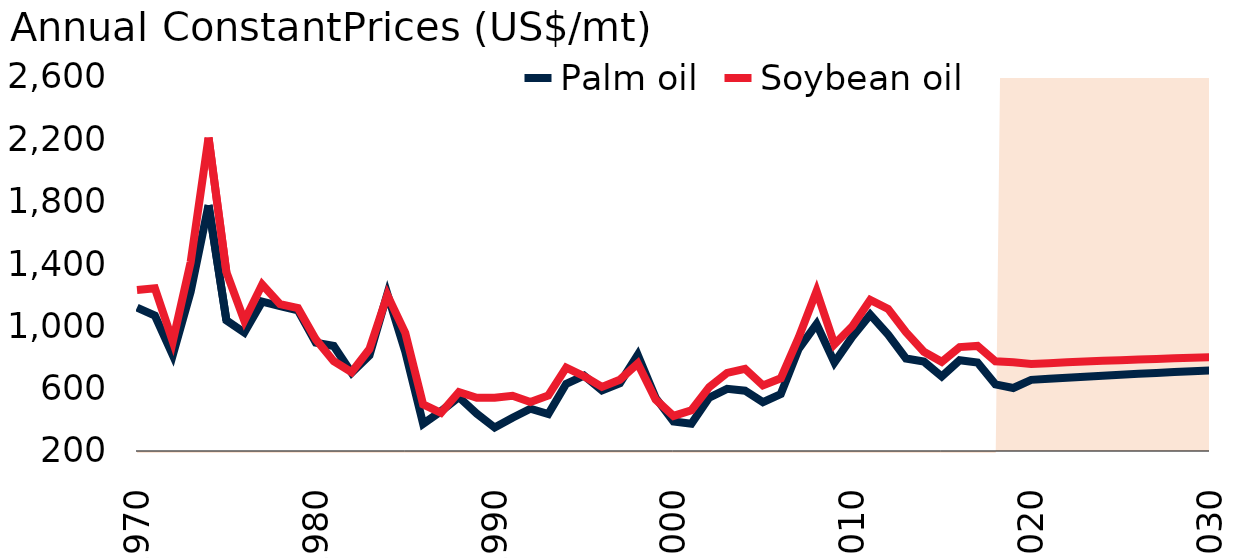
| Category | Palm oil | Soybean oil |
|---|---|---|
| 1970.0 | 1120.182 | 1233.419 |
| 1971.0 | 1068.791 | 1244.13 |
| 1972.0 | 815.759 | 903.34 |
| 1973.0 | 1222.337 | 1411.615 |
| 1974.0 | 1777.509 | 2210.861 |
| 1975.0 | 1038.612 | 1347.596 |
| 1976.0 | 960.711 | 1035.858 |
| 1977.0 | 1158.72 | 1268.52 |
| 1978.0 | 1129.344 | 1141.885 |
| 1979.0 | 1102.611 | 1116.692 |
| 1980.0 | 894.898 | 916.235 |
| 1981.0 | 873.931 | 776.201 |
| 1982.0 | 702.535 | 705.954 |
| 1983.0 | 813.026 | 854.305 |
| 1984.0 | 1208.346 | 1200.333 |
| 1985.0 | 838.672 | 958.323 |
| 1986.0 | 374.359 | 498.781 |
| 1987.0 | 455.38 | 444.303 |
| 1988.0 | 545.687 | 578.453 |
| 1989.0 | 440.039 | 541.86 |
| 1990.0 | 350.48 | 541.092 |
| 1991.0 | 413.858 | 554.049 |
| 1992.0 | 471.579 | 514.023 |
| 1993.0 | 437.603 | 556.536 |
| 1994.0 | 631.097 | 735.201 |
| 1995.0 | 683.474 | 680.029 |
| 1996.0 | 588.804 | 611.632 |
| 1997.0 | 635.265 | 657.281 |
| 1998.0 | 816.692 | 761.725 |
| 1999.0 | 541.001 | 530.247 |
| 2000.0 | 389.959 | 425.015 |
| 2001.0 | 375.385 | 461.282 |
| 2002.0 | 542.917 | 610.059 |
| 2003.0 | 598.738 | 701.582 |
| 2004.0 | 587.209 | 727.101 |
| 2005.0 | 513.731 | 620.942 |
| 2006.0 | 565.241 | 666.475 |
| 2007.0 | 855.799 | 928.491 |
| 2008.0 | 1014.182 | 1226.065 |
| 2009.0 | 768.328 | 884.352 |
| 2010.0 | 933.023 | 1000.856 |
| 2011.0 | 1075.149 | 1169.108 |
| 2012.0 | 947.035 | 1112.413 |
| 2013.0 | 793.773 | 962.12 |
| 2014.0 | 773.876 | 837.175 |
| 2015.0 | 677.912 | 772.173 |
| 2016.0 | 782.383 | 866.705 |
| 2017.0 | 768.377 | 874.082 |
| 2018.0 | 627.488 | 775.319 |
| 2019.0 | 604.522 | 769.456 |
| 2020.0 | 656.635 | 757.656 |
| 2021.0 | 663.884 | 763.582 |
| 2022.0 | 670.695 | 768.961 |
| 2023.0 | 677.182 | 773.928 |
| 2024.0 | 683.409 | 778.559 |
| 2025.0 | 689.418 | 782.905 |
| 2026.0 | 695.238 | 787.001 |
| 2027.0 | 700.888 | 790.872 |
| 2028.0 | 706.383 | 794.536 |
| 2029.0 | 711.731 | 798.004 |
| 2030.0 | 716.938 | 801.284 |